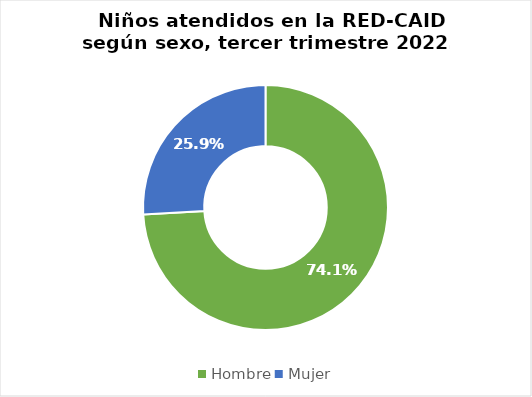
| Category | Cantidad |
|---|---|
| Hombre | 1877 |
| Mujer | 656 |